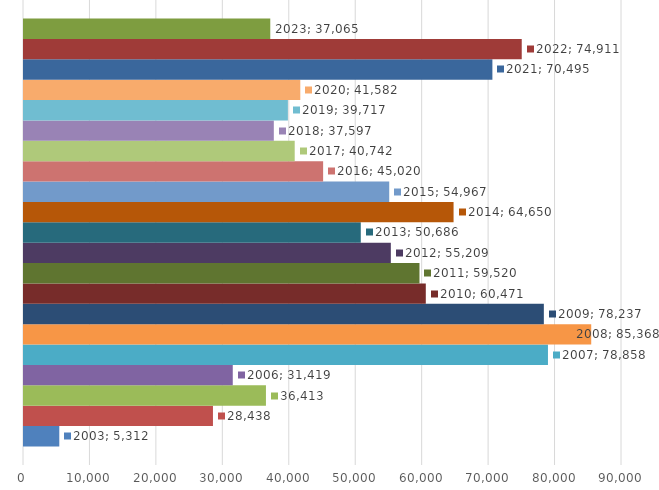
| Category | 2003 | 2004 | 2005 | 2006 | 2007 | 2008 | 2009 | 2010 | 2011 | 2012 | 2013 | 2014 | 2015 | 2016 | 2017 | 2018 | 2019 | 2020 | 2021 | 2022 | 2023 |
|---|---|---|---|---|---|---|---|---|---|---|---|---|---|---|---|---|---|---|---|---|---|
| 0 | 5312 | 28438 | 36413 | 31419 | 78858 | 85368 | 78237 | 60471 | 59520 | 55209 | 50686 | 64650 | 54967 | 45020 | 40742 | 37597 | 39717 | 41582 | 70495 | 74911 | 37065 |